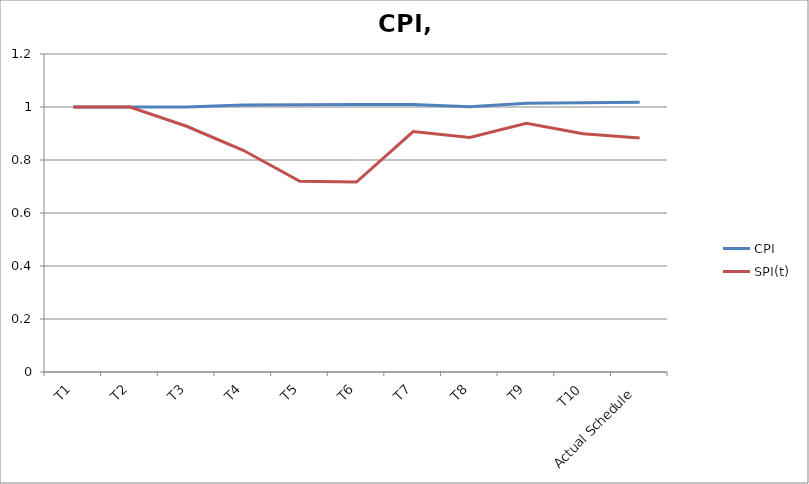
| Category | CPI | SPI(t) |
|---|---|---|
| T1 | 1 | 1 |
| T2 | 1 | 1 |
| T3 | 1 | 0.927 |
| T4 | 1.008 | 0.837 |
| T5 | 1.008 | 0.72 |
| T6 | 1.01 | 0.717 |
| T7 | 1.01 | 0.907 |
| T8 | 1.001 | 0.885 |
| T9 | 1.014 | 0.939 |
| T10 | 1.016 | 0.899 |
| Actual Schedule | 1.018 | 0.883 |